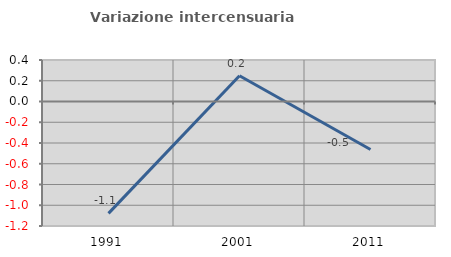
| Category | Variazione intercensuaria annua |
|---|---|
| 1991.0 | -1.078 |
| 2001.0 | 0.248 |
| 2011.0 | -0.463 |